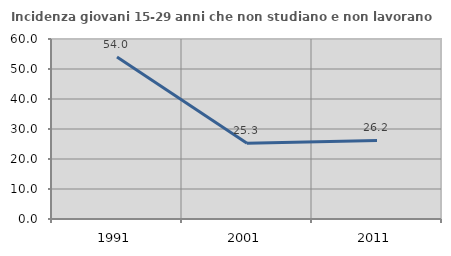
| Category | Incidenza giovani 15-29 anni che non studiano e non lavorano  |
|---|---|
| 1991.0 | 54.027 |
| 2001.0 | 25.281 |
| 2011.0 | 26.174 |